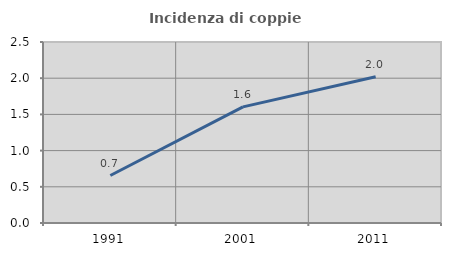
| Category | Incidenza di coppie miste |
|---|---|
| 1991.0 | 0.656 |
| 2001.0 | 1.604 |
| 2011.0 | 2.021 |